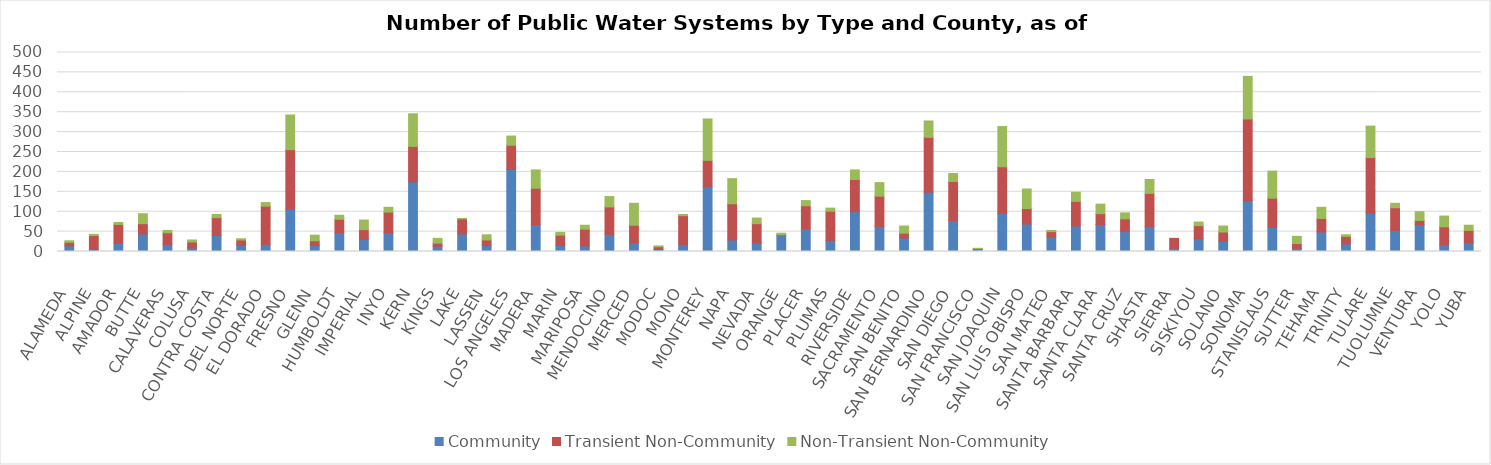
| Category | Community | Transient Non-Community | Non-Transient Non-Community |
|---|---|---|---|
| ALAMEDA | 14 | 9 | 4 |
| ALPINE | 5 | 35 | 3 |
| AMADOR | 21 | 47 | 5 |
| BUTTE | 44 | 26 | 25 |
| CALAVERAS | 18 | 29 | 6 |
| COLUSA | 9 | 15 | 5 |
| CONTRA COSTA | 40 | 45 | 8 |
| DEL NORTE | 16 | 13 | 3 |
| EL DORADO | 18 | 96 | 9 |
| FRESNO | 106 | 150 | 87 |
| GLENN | 15 | 12 | 14 |
| HUMBOLDT | 47 | 34 | 10 |
| IMPERIAL | 30 | 25 | 24 |
| INYO | 47 | 52 | 12 |
| KERN | 175 | 89 | 82 |
| KINGS | 13 | 8 | 12 |
| LAKE | 44 | 38 | 1 |
| LASSEN | 15 | 14 | 13 |
| LOS ANGELES | 206 | 61 | 23 |
| MADERA | 67 | 92 | 46 |
| MARIN | 15 | 26 | 7 |
| MARIPOSA | 14 | 42 | 10 |
| MENDOCINO | 43 | 69 | 26 |
| MERCED | 22 | 44 | 55 |
| MODOC | 5 | 7 | 2 |
| MONO | 18 | 72 | 3 |
| MONTEREY | 162 | 67 | 104 |
| NAPA | 29 | 91 | 63 |
| NEVADA | 21 | 49 | 14 |
| ORANGE | 40 | 2 | 4 |
| PLACER | 57 | 58 | 13 |
| PLUMAS | 28 | 73 | 8 |
| RIVERSIDE | 100 | 81 | 24 |
| SACRAMENTO | 63 | 76 | 34 |
| SAN BENITO | 34 | 12 | 18 |
| SAN BERNARDINO | 149 | 138 | 41 |
| SAN DIEGO | 78 | 98 | 20 |
| SAN FRANCISCO | 5 | 2 | 1 |
| SAN JOAQUIN | 96 | 117 | 101 |
| SAN LUIS OBISPO | 69 | 39 | 49 |
| SAN MATEO | 37 | 13 | 3 |
| SANTA BARBARA | 64 | 62 | 23 |
| SANTA CLARA | 68 | 27 | 24 |
| SANTA CRUZ | 50 | 32 | 15 |
| SHASTA | 63 | 83 | 35 |
| SIERRA | 8 | 25 | 0 |
| SISKIYOU | 32 | 33 | 9 |
| SOLANO | 26 | 23 | 15 |
| SONOMA | 128 | 205 | 107 |
| STANISLAUS | 61 | 73 | 68 |
| SUTTER | 8 | 12 | 18 |
| TEHAMA | 49 | 34 | 28 |
| TRINITY | 19 | 19 | 4 |
| TULARE | 97 | 139 | 79 |
| TUOLUMNE | 53 | 57 | 11 |
| VENTURA | 67 | 11 | 22 |
| YOLO | 17 | 45 | 27 |
| YUBA | 22 | 31 | 13 |